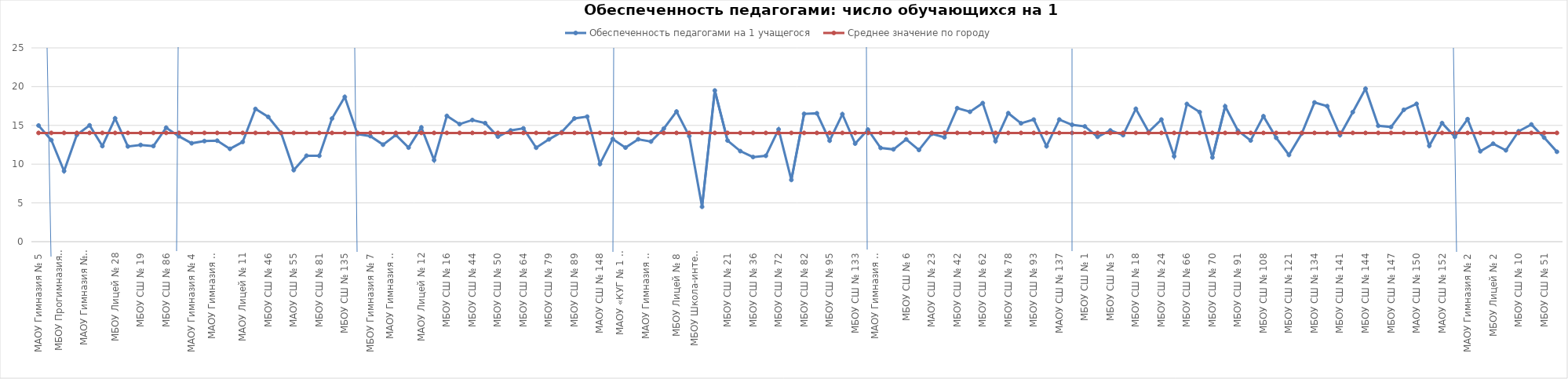
| Category | Обеспеченность педагогами на 1 учащегося | Среднее значение по городу |
|---|---|---|
| МАОУ Гимназия № 5 | 14.982 | 14.03 |
| ЖЕЛЕЗНОДОРОЖНЫЙ РАЙОН | 13.104 | 14.03 |
| МБОУ Прогимназия  № 131 | 9.111 | 14.03 |
| МБОУ Гимназия № 8 | 13.774 | 14.03 |
| МАОУ Гимназия №  9 | 15.01 | 14.03 |
| МАОУ Лицей № 7 | 12.333 | 14.03 |
| МБОУ Лицей № 28 | 15.907 | 14.03 |
| МБОУ СШ  № 12 | 12.286 | 14.03 |
| МБОУ СШ № 19 | 12.478 | 14.03 |
| МАОУ СШ № 32 | 12.333 | 14.03 |
| МБОУ СШ № 86 | 14.707 | 14.03 |
| КИРОВСКИЙ РАЙОН | 13.6 | 14.03 |
| МАОУ Гимназия № 4 | 12.695 | 14.03 |
| МАОУ Гимназия № 6 | 12.98 | 14.03 |
| МАОУ Гимназия № 10 | 13.027 | 14.03 |
| МАОУ Лицей № 6 "Перспектива" | 11.977 | 14.03 |
| МАОУ Лицей № 11 | 12.869 | 14.03 |
| МБОУ СШ № 8 "Созидание" | 17.122 | 14.03 |
| МБОУ СШ № 46 | 16.098 | 14.03 |
| МБОУ СШ № 49 | 14.061 | 14.03 |
| МАОУ СШ № 55 | 9.235 | 14.03 |
| МБОУ СШ № 63 | 11.087 | 14.03 |
| МБОУ СШ № 81 | 11.08 | 14.03 |
| МБОУ СШ № 90 | 15.886 | 14.03 |
| МБОУ СШ № 135 | 18.676 | 14.03 |
| ЛЕНИНСКИЙ РАЙОН | 13.879 | 14.03 |
| МБОУ Гимназия № 7 | 13.623 | 14.03 |
| МАОУ Гимназия № 11 | 12.515 | 14.03 |
| МАОУ Гимназия № 15 | 13.771 | 14.03 |
| МБОУ Лицей № 3 | 12.135 | 14.03 |
| МАОУ Лицей № 12 | 14.736 | 14.03 |
| МБОУ СШ № 13 | 10.523 | 14.03 |
| МБОУ СШ № 16 | 16.226 | 14.03 |
| МБОУ СШ № 31 | 15.162 | 14.03 |
| МБОУ СШ № 44 | 15.694 | 14.03 |
| МБОУ СШ № 47 | 15.293 | 14.03 |
| МБОУ СШ № 50 | 13.552 | 14.03 |
| МБОУ СШ № 53 | 14.345 | 14.03 |
| МБОУ СШ № 64 | 14.617 | 14.03 |
| МБОУ СШ № 65 | 12.121 | 14.03 |
| МБОУ СШ № 79 | 13.2 | 14.03 |
| МБОУ СШ № 88 | 14.13 | 14.03 |
| МБОУ СШ № 89 | 15.897 | 14.03 |
| МБОУ СШ № 94 | 16.13 | 14.03 |
| МАОУ СШ № 148 | 10.026 | 14.03 |
| ОКТЯБРЬСКИЙ РАЙОН | 13.242 | 14.03 |
| МАОУ «КУГ № 1 – Универс» | 12.133 | 14.03 |
| МАОУ Гимназия № 3 | 13.213 | 14.03 |
| МАОУ Гимназия № 13 "Академ" | 12.915 | 14.03 |
| МАОУ Лицей № 1 | 14.58 | 14.03 |
| МБОУ Лицей № 8 | 16.789 | 14.03 |
| МБОУ Лицей № 10 | 13.62 | 14.03 |
| МБОУ Школа-интернат № 1 | 4.5 | 14.03 |
| МБОУ СШ № 3 | 19.5 | 14.03 |
| МБОУ СШ № 21 | 13.051 | 14.03 |
| МБОУ СШ № 30 | 11.682 | 14.03 |
| МБОУ СШ № 36 | 10.917 | 14.03 |
| МБОУ СШ № 39 | 11.078 | 14.03 |
| МБОУ СШ № 72 | 14.484 | 14.03 |
| МБОУ СШ № 73 | 7.964 | 14.03 |
| МБОУ СШ № 82 | 16.489 | 14.03 |
| МБОУ СШ № 84 | 16.561 | 14.03 |
| МБОУ СШ № 95 | 13.032 | 14.03 |
| МБОУ СШ № 99 | 16.448 | 14.03 |
| МБОУ СШ № 133 | 12.65 | 14.03 |
| СВЕРДЛОВСКИЙ РАЙОН | 14.459 | 14.03 |
| МАОУ Гимназия № 14 | 12.096 | 14.03 |
| МАОУ Лицей № 9 "Лидер" | 11.909 | 14.03 |
| МБОУ СШ № 6 | 13.2 | 14.03 |
| МБОУ СШ № 17 | 11.833 | 14.03 |
| МАОУ СШ № 23 | 13.902 | 14.03 |
| МБОУ СШ № 34 | 13.462 | 14.03 |
| МБОУ СШ № 42 | 17.224 | 14.03 |
| МБОУ СШ № 45 | 16.757 | 14.03 |
| МБОУ СШ № 62 | 17.875 | 14.03 |
| МБОУ СШ № 76 | 12.967 | 14.03 |
| МБОУ СШ № 78 | 16.575 | 14.03 |
| МБОУ СШ № 92 | 15.269 | 14.03 |
| МБОУ СШ № 93 | 15.75 | 14.03 |
| МБОУ СШ № 97 | 12.314 | 14.03 |
| МАОУ СШ № 137 | 15.756 | 14.03 |
| СОВЕТСКИЙ РАЙОН | 15.078 | 14.03 |
| МБОУ СШ № 1 | 14.869 | 14.03 |
| МБОУ СШ № 2 | 13.525 | 14.03 |
| МБОУ СШ № 5 | 14.347 | 14.03 |
| МБОУ СШ № 7 | 13.744 | 14.03 |
| МБОУ СШ № 18 | 17.138 | 14.03 |
| МАОУ СШ № 22 | 14.16 | 14.03 |
| МБОУ СШ № 24 | 15.752 | 14.03 |
| МБОУ СШ № 56 | 11.022 | 14.03 |
| МБОУ СШ № 66 | 17.762 | 14.03 |
| МБОУ СШ № 69 | 16.722 | 14.03 |
| МБОУ СШ № 70 | 10.863 | 14.03 |
| МБОУ СШ № 85 | 17.456 | 14.03 |
| МБОУ СШ № 91 | 14.317 | 14.03 |
| МБОУ СШ № 98 | 13.05 | 14.03 |
| МБОУ СШ № 108 | 16.182 | 14.03 |
| МБОУ СШ № 115 | 13.4 | 14.03 |
| МБОУ СШ № 121 | 11.186 | 14.03 |
| МБОУ СШ № 129 | 13.944 | 14.03 |
| МБОУ СШ № 134 | 17.959 | 14.03 |
| МБОУ СШ № 139 | 17.484 | 14.03 |
| МБОУ СШ № 141 | 13.739 | 14.03 |
| МАОУ СШ № 143 | 16.709 | 14.03 |
| МБОУ СШ № 144 | 19.73 | 14.03 |
| МАОУ СШ № 145 | 14.948 | 14.03 |
| МБОУ СШ № 147 | 14.795 | 14.03 |
| МАОУ СШ № 149 | 17.007 | 14.03 |
| МАОУ СШ № 150 | 17.78 | 14.03 |
| МАОУ СШ № 151 | 12.365 | 14.03 |
| МАОУ СШ № 152 | 15.296 | 14.03 |
| ЦЕНТРАЛЬНЫЙ РАЙОН | 13.526 | 14.03 |
| МАОУ Гимназия № 2 | 15.806 | 14.03 |
| МБОУ  Гимназия № 16 | 11.662 | 14.03 |
| МБОУ Лицей № 2 | 12.638 | 14.03 |
| МБОУ СШ № 4 | 11.787 | 14.03 |
| МБОУ СШ № 10 | 14.243 | 14.03 |
| МБОУ СШ № 27 | 15.122 | 14.03 |
| МБОУ СШ № 51 | 13.425 | 14.03 |
| МАОУ СШ № 153 | 11.601 | 14.03 |